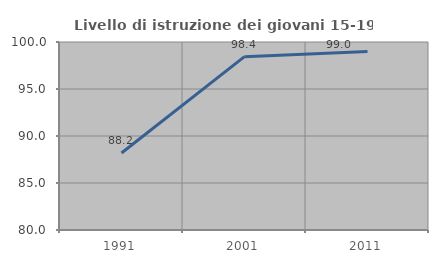
| Category | Livello di istruzione dei giovani 15-19 anni |
|---|---|
| 1991.0 | 88.189 |
| 2001.0 | 98.438 |
| 2011.0 | 98.99 |